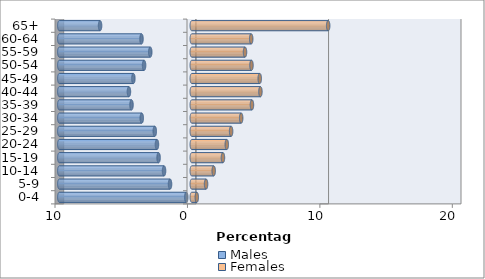
| Category | Males | Females |
|---|---|---|
| 0-4 | -0.417 | 0.378 |
| 5-9 | -1.642 | 1.079 |
| 10-14 | -2.094 | 1.655 |
| 15-19 | -2.506 | 2.354 |
| 20-24 | -2.629 | 2.644 |
| 25-29 | -2.793 | 2.969 |
| 30-34 | -3.777 | 3.73 |
| 35-39 | -4.551 | 4.543 |
| 40-44 | -4.745 | 5.183 |
| 45-49 | -4.41 | 5.132 |
| 50-54 | -3.601 | 4.507 |
| 55-59 | -3.135 | 4.019 |
| 60-64 | -3.797 | 4.487 |
| 65+ | -6.925 | 10.299 |